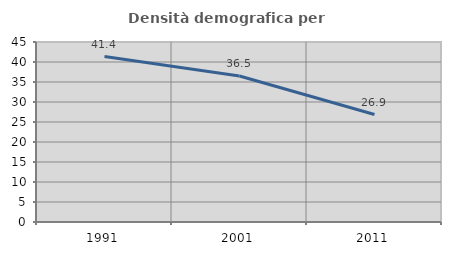
| Category | Densità demografica |
|---|---|
| 1991.0 | 41.358 |
| 2001.0 | 36.485 |
| 2011.0 | 26.864 |